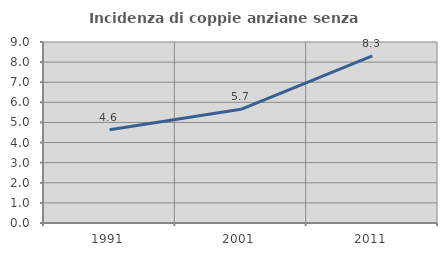
| Category | Incidenza di coppie anziane senza figli  |
|---|---|
| 1991.0 | 4.633 |
| 2001.0 | 5.651 |
| 2011.0 | 8.309 |